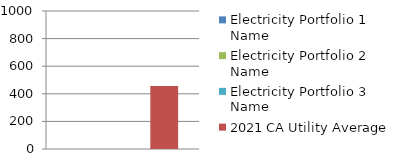
| Category | Electricity Portfolio 1 Name | Electricity Portfolio 2 Name | Electricity Portfolio 3 Name | 2021 CA Utility Average |
|---|---|---|---|---|
| 0 | 0 | 0 | 0 | 456 |